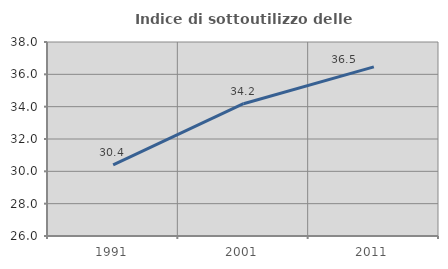
| Category | Indice di sottoutilizzo delle abitazioni  |
|---|---|
| 1991.0 | 30.398 |
| 2001.0 | 34.182 |
| 2011.0 | 36.46 |